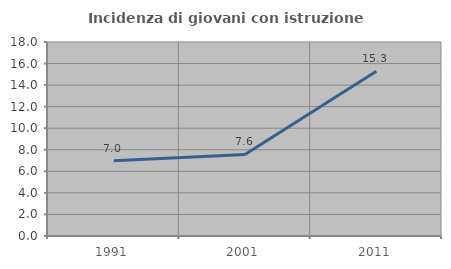
| Category | Incidenza di giovani con istruzione universitaria |
|---|---|
| 1991.0 | 6.977 |
| 2001.0 | 7.563 |
| 2011.0 | 15.294 |